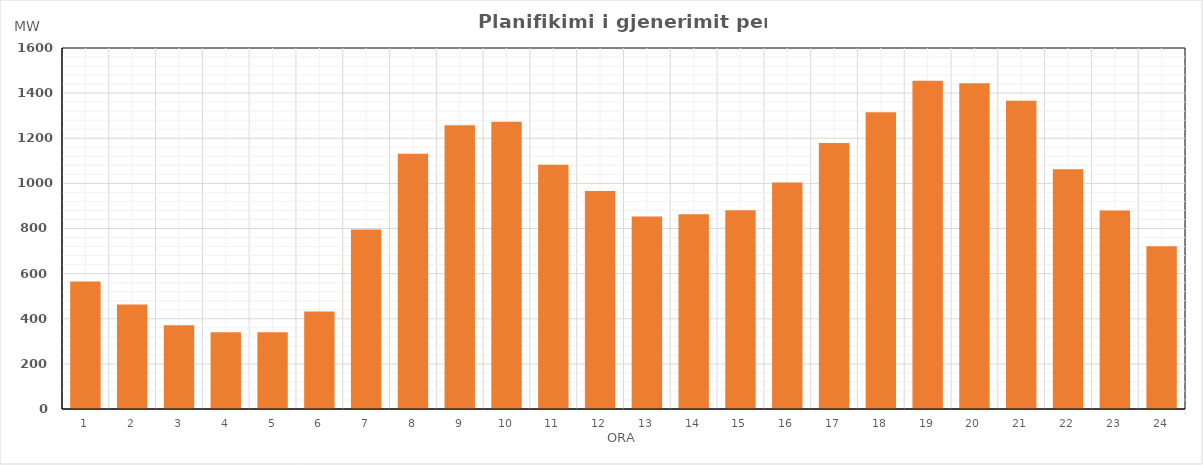
| Category | Max (MW) |
|---|---|
| 0 | 565.08 |
| 1 | 462.99 |
| 2 | 371.16 |
| 3 | 340.18 |
| 4 | 340.06 |
| 5 | 431.75 |
| 6 | 795.29 |
| 7 | 1131.48 |
| 8 | 1257.36 |
| 9 | 1273.6 |
| 10 | 1082.75 |
| 11 | 966.4 |
| 12 | 853.49 |
| 13 | 862.89 |
| 14 | 880.59 |
| 15 | 1003.6 |
| 16 | 1178.66 |
| 17 | 1315.42 |
| 18 | 1454.33 |
| 19 | 1443.81 |
| 20 | 1366.27 |
| 21 | 1063.07 |
| 22 | 880.16 |
| 23 | 721.06 |